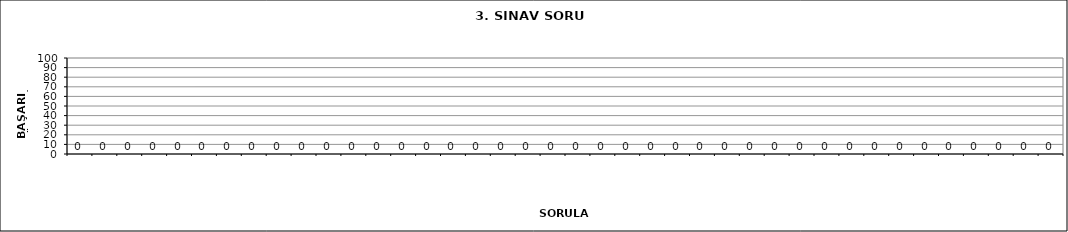
| Category | Series 0 |
|---|---|
| 0 | 0 |
| 1 | 0 |
| 2 | 0 |
| 3 | 0 |
| 4 | 0 |
| 5 | 0 |
| 6 | 0 |
| 7 | 0 |
| 8 | 0 |
| 9 | 0 |
| 10 | 0 |
| 11 | 0 |
| 12 | 0 |
| 13 | 0 |
| 14 | 0 |
| 15 | 0 |
| 16 | 0 |
| 17 | 0 |
| 18 | 0 |
| 19 | 0 |
| 20 | 0 |
| 21 | 0 |
| 22 | 0 |
| 23 | 0 |
| 24 | 0 |
| 25 | 0 |
| 26 | 0 |
| 27 | 0 |
| 28 | 0 |
| 29 | 0 |
| 30 | 0 |
| 31 | 0 |
| 32 | 0 |
| 33 | 0 |
| 34 | 0 |
| 35 | 0 |
| 36 | 0 |
| 37 | 0 |
| 38 | 0 |
| 39 | 0 |